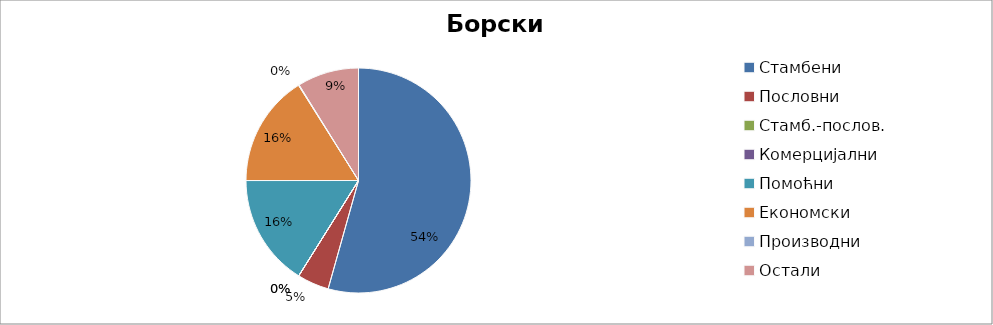
| Category | Борски |
|---|---|
| Стамбени | 13175 |
| Пословни | 1106 |
| Стамб.-послов. | 0 |
| Комерцијални | 0 |
| Помоћни | 3898 |
| Економски | 3892 |
| Производни | 23 |
| Остали | 2148 |